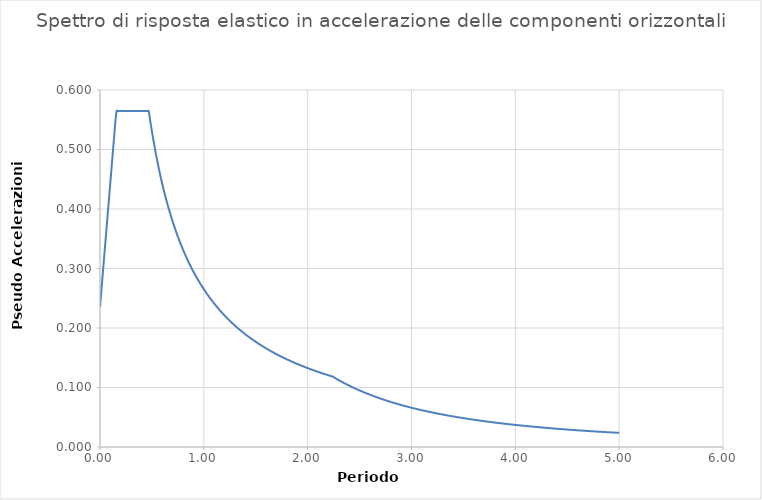
| Category | SPETTRO ELASTICO |
|---|---|
| 0.0 | 0.235 |
| 0.01 | 0.256 |
| 0.02 | 0.277 |
| 0.03 | 0.298 |
| 0.04 | 0.319 |
| 0.05 | 0.34 |
| 0.060000000000000005 | 0.361 |
| 0.07 | 0.382 |
| 0.08 | 0.403 |
| 0.09 | 0.425 |
| 0.09999999999999999 | 0.446 |
| 0.10999999999999999 | 0.467 |
| 0.11999999999999998 | 0.488 |
| 0.12999999999999998 | 0.509 |
| 0.13999999999999999 | 0.53 |
| 0.15 | 0.551 |
| 0.16 | 0.565 |
| 0.17 | 0.565 |
| 0.18000000000000002 | 0.565 |
| 0.19000000000000003 | 0.565 |
| 0.20000000000000004 | 0.565 |
| 0.21000000000000005 | 0.565 |
| 0.22000000000000006 | 0.565 |
| 0.23000000000000007 | 0.565 |
| 0.24000000000000007 | 0.565 |
| 0.25000000000000006 | 0.565 |
| 0.26000000000000006 | 0.565 |
| 0.2700000000000001 | 0.565 |
| 0.2800000000000001 | 0.565 |
| 0.2900000000000001 | 0.565 |
| 0.3000000000000001 | 0.565 |
| 0.3100000000000001 | 0.565 |
| 0.3200000000000001 | 0.565 |
| 0.3300000000000001 | 0.565 |
| 0.34000000000000014 | 0.565 |
| 0.35000000000000014 | 0.565 |
| 0.36000000000000015 | 0.565 |
| 0.37000000000000016 | 0.565 |
| 0.38000000000000017 | 0.565 |
| 0.3900000000000002 | 0.565 |
| 0.4000000000000002 | 0.565 |
| 0.4100000000000002 | 0.565 |
| 0.4200000000000002 | 0.565 |
| 0.4300000000000002 | 0.565 |
| 0.4400000000000002 | 0.565 |
| 0.45000000000000023 | 0.565 |
| 0.46000000000000024 | 0.565 |
| 0.47000000000000025 | 0.564 |
| 0.48000000000000026 | 0.552 |
| 0.49000000000000027 | 0.541 |
| 0.5000000000000002 | 0.53 |
| 0.5100000000000002 | 0.52 |
| 0.5200000000000002 | 0.51 |
| 0.5300000000000002 | 0.5 |
| 0.5400000000000003 | 0.491 |
| 0.5500000000000003 | 0.482 |
| 0.5600000000000003 | 0.474 |
| 0.5700000000000003 | 0.465 |
| 0.5800000000000003 | 0.457 |
| 0.5900000000000003 | 0.449 |
| 0.6000000000000003 | 0.442 |
| 0.6100000000000003 | 0.435 |
| 0.6200000000000003 | 0.428 |
| 0.6300000000000003 | 0.421 |
| 0.6400000000000003 | 0.414 |
| 0.6500000000000004 | 0.408 |
| 0.6600000000000004 | 0.402 |
| 0.6700000000000004 | 0.396 |
| 0.6800000000000004 | 0.39 |
| 0.6900000000000004 | 0.384 |
| 0.7000000000000004 | 0.379 |
| 0.7100000000000004 | 0.373 |
| 0.7200000000000004 | 0.368 |
| 0.7300000000000004 | 0.363 |
| 0.7400000000000004 | 0.358 |
| 0.7500000000000004 | 0.354 |
| 0.7600000000000005 | 0.349 |
| 0.7700000000000005 | 0.344 |
| 0.7800000000000005 | 0.34 |
| 0.7900000000000005 | 0.336 |
| 0.8000000000000005 | 0.331 |
| 0.8100000000000005 | 0.327 |
| 0.8200000000000005 | 0.323 |
| 0.8300000000000005 | 0.319 |
| 0.8400000000000005 | 0.316 |
| 0.8500000000000005 | 0.312 |
| 0.8600000000000005 | 0.308 |
| 0.8700000000000006 | 0.305 |
| 0.8800000000000006 | 0.301 |
| 0.8900000000000006 | 0.298 |
| 0.9000000000000006 | 0.295 |
| 0.9100000000000006 | 0.291 |
| 0.9200000000000006 | 0.288 |
| 0.9300000000000006 | 0.285 |
| 0.9400000000000006 | 0.282 |
| 0.9500000000000006 | 0.279 |
| 0.9600000000000006 | 0.276 |
| 0.9700000000000006 | 0.273 |
| 0.9800000000000006 | 0.271 |
| 0.9900000000000007 | 0.268 |
| 1.0000000000000007 | 0.265 |
| 1.0100000000000007 | 0.263 |
| 1.0200000000000007 | 0.26 |
| 1.0300000000000007 | 0.257 |
| 1.0400000000000007 | 0.255 |
| 1.0500000000000007 | 0.253 |
| 1.0600000000000007 | 0.25 |
| 1.0700000000000007 | 0.248 |
| 1.0800000000000007 | 0.246 |
| 1.0900000000000007 | 0.243 |
| 1.1000000000000008 | 0.241 |
| 1.1100000000000008 | 0.239 |
| 1.1200000000000008 | 0.237 |
| 1.1300000000000008 | 0.235 |
| 1.1400000000000008 | 0.233 |
| 1.1500000000000008 | 0.231 |
| 1.1600000000000008 | 0.229 |
| 1.1700000000000008 | 0.227 |
| 1.1800000000000008 | 0.225 |
| 1.1900000000000008 | 0.223 |
| 1.2000000000000008 | 0.221 |
| 1.2100000000000009 | 0.219 |
| 1.2200000000000009 | 0.217 |
| 1.2300000000000009 | 0.216 |
| 1.2400000000000009 | 0.214 |
| 1.2500000000000009 | 0.212 |
| 1.260000000000001 | 0.21 |
| 1.270000000000001 | 0.209 |
| 1.280000000000001 | 0.207 |
| 1.290000000000001 | 0.206 |
| 1.300000000000001 | 0.204 |
| 1.310000000000001 | 0.202 |
| 1.320000000000001 | 0.201 |
| 1.330000000000001 | 0.199 |
| 1.340000000000001 | 0.198 |
| 1.350000000000001 | 0.196 |
| 1.360000000000001 | 0.195 |
| 1.370000000000001 | 0.194 |
| 1.380000000000001 | 0.192 |
| 1.390000000000001 | 0.191 |
| 1.400000000000001 | 0.189 |
| 1.410000000000001 | 0.188 |
| 1.420000000000001 | 0.187 |
| 1.430000000000001 | 0.185 |
| 1.440000000000001 | 0.184 |
| 1.450000000000001 | 0.183 |
| 1.460000000000001 | 0.182 |
| 1.470000000000001 | 0.18 |
| 1.480000000000001 | 0.179 |
| 1.490000000000001 | 0.178 |
| 1.500000000000001 | 0.177 |
| 1.5100000000000011 | 0.176 |
| 1.5200000000000011 | 0.174 |
| 1.5300000000000011 | 0.173 |
| 1.5400000000000011 | 0.172 |
| 1.5500000000000012 | 0.171 |
| 1.5600000000000012 | 0.17 |
| 1.5700000000000012 | 0.169 |
| 1.5800000000000012 | 0.168 |
| 1.5900000000000012 | 0.167 |
| 1.6000000000000012 | 0.166 |
| 1.6100000000000012 | 0.165 |
| 1.6200000000000012 | 0.164 |
| 1.6300000000000012 | 0.163 |
| 1.6400000000000012 | 0.162 |
| 1.6500000000000012 | 0.161 |
| 1.6600000000000013 | 0.16 |
| 1.6700000000000013 | 0.159 |
| 1.6800000000000013 | 0.158 |
| 1.6900000000000013 | 0.157 |
| 1.7000000000000013 | 0.156 |
| 1.7100000000000013 | 0.155 |
| 1.7200000000000013 | 0.154 |
| 1.7300000000000013 | 0.153 |
| 1.7400000000000013 | 0.152 |
| 1.7500000000000013 | 0.152 |
| 1.7600000000000013 | 0.151 |
| 1.7700000000000014 | 0.15 |
| 1.7800000000000014 | 0.149 |
| 1.7900000000000014 | 0.148 |
| 1.8000000000000014 | 0.147 |
| 1.8100000000000014 | 0.146 |
| 1.8200000000000014 | 0.146 |
| 1.8300000000000014 | 0.145 |
| 1.8400000000000014 | 0.144 |
| 1.8500000000000014 | 0.143 |
| 1.8600000000000014 | 0.143 |
| 1.8700000000000014 | 0.142 |
| 1.8800000000000014 | 0.141 |
| 1.8900000000000015 | 0.14 |
| 1.9000000000000015 | 0.14 |
| 1.9100000000000015 | 0.139 |
| 1.9200000000000015 | 0.138 |
| 1.9300000000000015 | 0.137 |
| 1.9400000000000015 | 0.137 |
| 1.9500000000000015 | 0.136 |
| 1.9600000000000015 | 0.135 |
| 1.9700000000000015 | 0.135 |
| 1.9800000000000015 | 0.134 |
| 1.9900000000000015 | 0.133 |
| 2.0000000000000013 | 0.133 |
| 2.010000000000001 | 0.132 |
| 2.020000000000001 | 0.131 |
| 2.0300000000000007 | 0.131 |
| 2.0400000000000005 | 0.13 |
| 2.0500000000000003 | 0.129 |
| 2.06 | 0.129 |
| 2.07 | 0.128 |
| 2.0799999999999996 | 0.127 |
| 2.0899999999999994 | 0.127 |
| 2.099999999999999 | 0.126 |
| 2.109999999999999 | 0.126 |
| 2.1199999999999988 | 0.125 |
| 2.1299999999999986 | 0.124 |
| 2.1399999999999983 | 0.124 |
| 2.149999999999998 | 0.123 |
| 2.159999999999998 | 0.123 |
| 2.1699999999999977 | 0.122 |
| 2.1799999999999975 | 0.122 |
| 2.1899999999999973 | 0.121 |
| 2.199999999999997 | 0.121 |
| 2.209999999999997 | 0.12 |
| 2.2199999999999966 | 0.119 |
| 2.2299999999999964 | 0.119 |
| 2.239999999999996 | 0.118 |
| 2.249999999999996 | 0.117 |
| 2.259999999999996 | 0.116 |
| 2.2699999999999956 | 0.115 |
| 2.2799999999999954 | 0.114 |
| 2.289999999999995 | 0.113 |
| 2.299999999999995 | 0.112 |
| 2.3099999999999947 | 0.111 |
| 2.3199999999999945 | 0.11 |
| 2.3299999999999943 | 0.109 |
| 2.339999999999994 | 0.108 |
| 2.349999999999994 | 0.108 |
| 2.3599999999999937 | 0.107 |
| 2.3699999999999934 | 0.106 |
| 2.3799999999999932 | 0.105 |
| 2.389999999999993 | 0.104 |
| 2.399999999999993 | 0.103 |
| 2.4099999999999926 | 0.102 |
| 2.4199999999999924 | 0.101 |
| 2.429999999999992 | 0.101 |
| 2.439999999999992 | 0.1 |
| 2.4499999999999917 | 0.099 |
| 2.4599999999999915 | 0.098 |
| 2.4699999999999913 | 0.097 |
| 2.479999999999991 | 0.097 |
| 2.489999999999991 | 0.096 |
| 2.4999999999999907 | 0.095 |
| 2.5099999999999905 | 0.094 |
| 2.5199999999999902 | 0.094 |
| 2.52999999999999 | 0.093 |
| 2.53999999999999 | 0.092 |
| 2.5499999999999896 | 0.091 |
| 2.5599999999999894 | 0.091 |
| 2.569999999999989 | 0.09 |
| 2.579999999999989 | 0.089 |
| 2.5899999999999888 | 0.089 |
| 2.5999999999999885 | 0.088 |
| 2.6099999999999883 | 0.087 |
| 2.619999999999988 | 0.087 |
| 2.629999999999988 | 0.086 |
| 2.6399999999999877 | 0.085 |
| 2.6499999999999875 | 0.085 |
| 2.6599999999999873 | 0.084 |
| 2.669999999999987 | 0.083 |
| 2.679999999999987 | 0.083 |
| 2.6899999999999866 | 0.082 |
| 2.6999999999999864 | 0.081 |
| 2.709999999999986 | 0.081 |
| 2.719999999999986 | 0.08 |
| 2.7299999999999858 | 0.08 |
| 2.7399999999999856 | 0.079 |
| 2.7499999999999853 | 0.079 |
| 2.759999999999985 | 0.078 |
| 2.769999999999985 | 0.077 |
| 2.7799999999999847 | 0.077 |
| 2.7899999999999845 | 0.076 |
| 2.7999999999999843 | 0.076 |
| 2.809999999999984 | 0.075 |
| 2.819999999999984 | 0.075 |
| 2.8299999999999836 | 0.074 |
| 2.8399999999999834 | 0.074 |
| 2.849999999999983 | 0.073 |
| 2.859999999999983 | 0.073 |
| 2.869999999999983 | 0.072 |
| 2.8799999999999826 | 0.072 |
| 2.8899999999999824 | 0.071 |
| 2.899999999999982 | 0.071 |
| 2.909999999999982 | 0.07 |
| 2.9199999999999817 | 0.07 |
| 2.9299999999999815 | 0.069 |
| 2.9399999999999813 | 0.069 |
| 2.949999999999981 | 0.068 |
| 2.959999999999981 | 0.068 |
| 2.9699999999999807 | 0.067 |
| 2.9799999999999804 | 0.067 |
| 2.9899999999999802 | 0.066 |
| 2.99999999999998 | 0.066 |
| 3.00999999999998 | 0.066 |
| 3.0199999999999796 | 0.065 |
| 3.0299999999999794 | 0.065 |
| 3.039999999999979 | 0.064 |
| 3.049999999999979 | 0.064 |
| 3.0599999999999787 | 0.063 |
| 3.0699999999999785 | 0.063 |
| 3.0799999999999783 | 0.063 |
| 3.089999999999978 | 0.062 |
| 3.099999999999978 | 0.062 |
| 3.1099999999999777 | 0.061 |
| 3.1199999999999775 | 0.061 |
| 3.1299999999999772 | 0.061 |
| 3.139999999999977 | 0.06 |
| 3.149999999999977 | 0.06 |
| 3.1599999999999766 | 0.059 |
| 3.1699999999999764 | 0.059 |
| 3.179999999999976 | 0.059 |
| 3.189999999999976 | 0.058 |
| 3.1999999999999758 | 0.058 |
| 3.2099999999999755 | 0.058 |
| 3.2199999999999753 | 0.057 |
| 3.229999999999975 | 0.057 |
| 3.239999999999975 | 0.057 |
| 3.2499999999999747 | 0.056 |
| 3.2599999999999745 | 0.056 |
| 3.2699999999999743 | 0.056 |
| 3.279999999999974 | 0.055 |
| 3.289999999999974 | 0.055 |
| 3.2999999999999736 | 0.055 |
| 3.3099999999999734 | 0.054 |
| 3.319999999999973 | 0.054 |
| 3.329999999999973 | 0.054 |
| 3.3399999999999728 | 0.053 |
| 3.3499999999999726 | 0.053 |
| 3.3599999999999723 | 0.053 |
| 3.369999999999972 | 0.052 |
| 3.379999999999972 | 0.052 |
| 3.3899999999999717 | 0.052 |
| 3.3999999999999715 | 0.051 |
| 3.4099999999999713 | 0.051 |
| 3.419999999999971 | 0.051 |
| 3.429999999999971 | 0.05 |
| 3.4399999999999706 | 0.05 |
| 3.4499999999999704 | 0.05 |
| 3.45999999999997 | 0.05 |
| 3.46999999999997 | 0.049 |
| 3.47999999999997 | 0.049 |
| 3.4899999999999696 | 0.049 |
| 3.4999999999999694 | 0.048 |
| 3.509999999999969 | 0.048 |
| 3.519999999999969 | 0.048 |
| 3.5299999999999687 | 0.048 |
| 3.5399999999999685 | 0.047 |
| 3.5499999999999683 | 0.047 |
| 3.559999999999968 | 0.047 |
| 3.569999999999968 | 0.047 |
| 3.5799999999999677 | 0.046 |
| 3.5899999999999674 | 0.046 |
| 3.5999999999999672 | 0.046 |
| 3.609999999999967 | 0.046 |
| 3.619999999999967 | 0.045 |
| 3.6299999999999666 | 0.045 |
| 3.6399999999999664 | 0.045 |
| 3.649999999999966 | 0.045 |
| 3.659999999999966 | 0.044 |
| 3.6699999999999657 | 0.044 |
| 3.6799999999999655 | 0.044 |
| 3.6899999999999653 | 0.044 |
| 3.699999999999965 | 0.043 |
| 3.709999999999965 | 0.043 |
| 3.7199999999999647 | 0.043 |
| 3.7299999999999645 | 0.043 |
| 3.7399999999999642 | 0.042 |
| 3.749999999999964 | 0.042 |
| 3.759999999999964 | 0.042 |
| 3.7699999999999636 | 0.042 |
| 3.7799999999999634 | 0.042 |
| 3.789999999999963 | 0.041 |
| 3.799999999999963 | 0.041 |
| 3.8099999999999627 | 0.041 |
| 3.8199999999999625 | 0.041 |
| 3.8299999999999623 | 0.04 |
| 3.839999999999962 | 0.04 |
| 3.849999999999962 | 0.04 |
| 3.8599999999999617 | 0.04 |
| 3.8699999999999615 | 0.04 |
| 3.8799999999999613 | 0.039 |
| 3.889999999999961 | 0.039 |
| 3.899999999999961 | 0.039 |
| 3.9099999999999606 | 0.039 |
| 3.9199999999999604 | 0.039 |
| 3.92999999999996 | 0.038 |
| 3.93999999999996 | 0.038 |
| 3.9499999999999598 | 0.038 |
| 3.9599999999999596 | 0.038 |
| 3.9699999999999593 | 0.038 |
| 3.979999999999959 | 0.038 |
| 3.989999999999959 | 0.037 |
| 3.9999999999999587 | 0.037 |
| 4.009999999999959 | 0.037 |
| 4.019999999999959 | 0.037 |
| 4.0299999999999585 | 0.037 |
| 4.039999999999958 | 0.036 |
| 4.049999999999958 | 0.036 |
| 4.059999999999958 | 0.036 |
| 4.069999999999958 | 0.036 |
| 4.079999999999957 | 0.036 |
| 4.089999999999957 | 0.036 |
| 4.099999999999957 | 0.035 |
| 4.109999999999957 | 0.035 |
| 4.119999999999957 | 0.035 |
| 4.129999999999956 | 0.035 |
| 4.139999999999956 | 0.035 |
| 4.149999999999956 | 0.034 |
| 4.159999999999956 | 0.034 |
| 4.1699999999999555 | 0.034 |
| 4.179999999999955 | 0.034 |
| 4.189999999999955 | 0.034 |
| 4.199999999999955 | 0.034 |
| 4.209999999999955 | 0.034 |
| 4.2199999999999545 | 0.033 |
| 4.229999999999954 | 0.033 |
| 4.239999999999954 | 0.033 |
| 4.249999999999954 | 0.033 |
| 4.259999999999954 | 0.033 |
| 4.269999999999953 | 0.033 |
| 4.279999999999953 | 0.032 |
| 4.289999999999953 | 0.032 |
| 4.299999999999953 | 0.032 |
| 4.3099999999999525 | 0.032 |
| 4.319999999999952 | 0.032 |
| 4.329999999999952 | 0.032 |
| 4.339999999999952 | 0.032 |
| 4.349999999999952 | 0.031 |
| 4.3599999999999515 | 0.031 |
| 4.369999999999951 | 0.031 |
| 4.379999999999951 | 0.031 |
| 4.389999999999951 | 0.031 |
| 4.399999999999951 | 0.031 |
| 4.40999999999995 | 0.031 |
| 4.41999999999995 | 0.03 |
| 4.42999999999995 | 0.03 |
| 4.43999999999995 | 0.03 |
| 4.4499999999999496 | 0.03 |
| 4.459999999999949 | 0.03 |
| 4.469999999999949 | 0.03 |
| 4.479999999999949 | 0.03 |
| 4.489999999999949 | 0.029 |
| 4.4999999999999485 | 0.029 |
| 4.509999999999948 | 0.029 |
| 4.519999999999948 | 0.029 |
| 4.529999999999948 | 0.029 |
| 4.539999999999948 | 0.029 |
| 4.549999999999947 | 0.029 |
| 4.559999999999947 | 0.029 |
| 4.569999999999947 | 0.028 |
| 4.579999999999947 | 0.028 |
| 4.589999999999947 | 0.028 |
| 4.599999999999946 | 0.028 |
| 4.609999999999946 | 0.028 |
| 4.619999999999946 | 0.028 |
| 4.629999999999946 | 0.028 |
| 4.6399999999999455 | 0.028 |
| 4.649999999999945 | 0.027 |
| 4.659999999999945 | 0.027 |
| 4.669999999999945 | 0.027 |
| 4.679999999999945 | 0.027 |
| 4.689999999999944 | 0.027 |
| 4.699999999999944 | 0.027 |
| 4.709999999999944 | 0.027 |
| 4.719999999999944 | 0.027 |
| 4.729999999999944 | 0.027 |
| 4.739999999999943 | 0.026 |
| 4.749999999999943 | 0.026 |
| 4.759999999999943 | 0.026 |
| 4.769999999999943 | 0.026 |
| 4.7799999999999425 | 0.026 |
| 4.789999999999942 | 0.026 |
| 4.799999999999942 | 0.026 |
| 4.809999999999942 | 0.026 |
| 4.819999999999942 | 0.026 |
| 4.8299999999999415 | 0.025 |
| 4.839999999999941 | 0.025 |
| 4.849999999999941 | 0.025 |
| 4.859999999999941 | 0.025 |
| 4.869999999999941 | 0.025 |
| 4.87999999999994 | 0.025 |
| 4.88999999999994 | 0.025 |
| 4.89999999999994 | 0.025 |
| 4.90999999999994 | 0.025 |
| 4.9199999999999395 | 0.025 |
| 4.929999999999939 | 0.024 |
| 4.939999999999939 | 0.024 |
| 4.949999999999939 | 0.024 |
| 4.959999999999939 | 0.024 |
| 4.9699999999999385 | 0.024 |
| 4.979999999999938 | 0.024 |
| 4.989999999999938 | 0.024 |
| 4.999999999999938 | 0.024 |